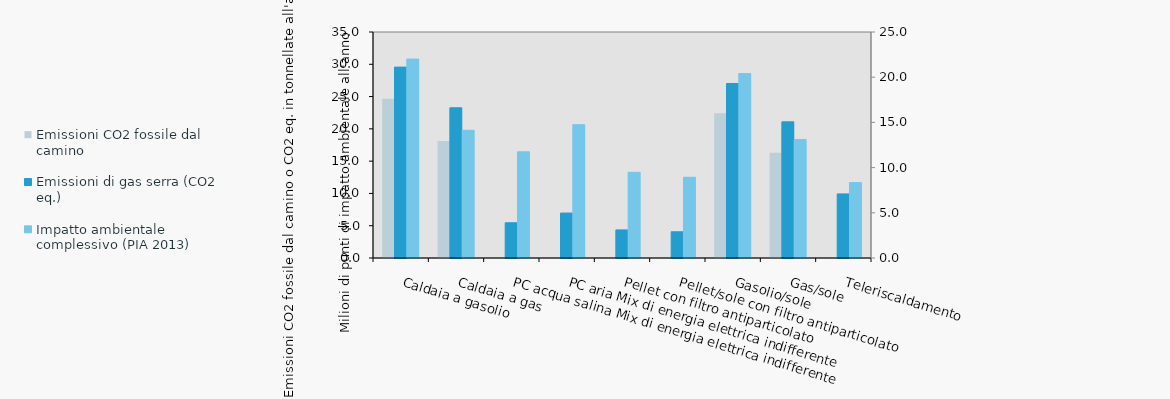
| Category | Emissioni CO2 fossile dal camino | Emissioni di gas serra (CO2 eq.) | Platzhalter |
|---|---|---|---|
| Caldaia a gasolio | 24.676 | 29.563 |  |
| Caldaia a gas | 18.117 | 23.266 |  |
| PC acqua salina Mix di energia elettrica indifferente | 0 | 5.456 |  |
| PC aria Mix di energia elettrica indifferente | 0 | 6.96 |  |
| Pellet con filtro antiparticolato | 0 | 4.347 |  |
| Pellet/sole con filtro antiparticolato | 0 | 4.061 |  |
| Gasolio/sole | 22.435 | 27.027 |  |
| Gas/sole | 16.305 | 21.088 |  |
| Teleriscaldamento | 0 | 9.924 |  |